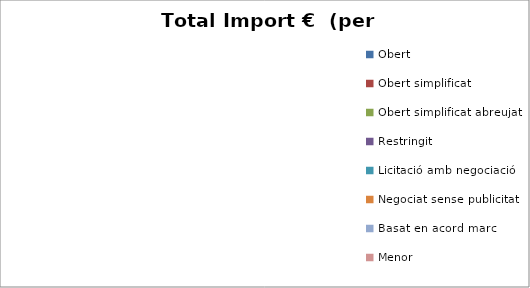
| Category | Total preu              (amb iva) |
|---|---|
| Obert | 0 |
| Obert simplificat | 0 |
| Obert simplificat abreujat | 0 |
| Restringit | 0 |
| Licitació amb negociació | 0 |
| Negociat sense publicitat | 0 |
| Basat en acord marc | 0 |
| Menor | 0 |